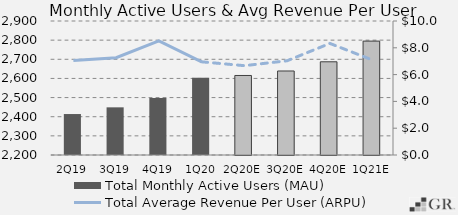
| Category | Total Monthly Active Users (MAU)  |
|---|---|
|  2Q19  | 2414 |
|  3Q19  | 2449 |
|  4Q19  | 2497.8 |
|  1Q20  | 2603 |
|  2Q20E  | 2615.452 |
|  3Q20E  | 2638.86 |
|  4Q20E  | 2686.945 |
|  1Q21E  | 2794.987 |